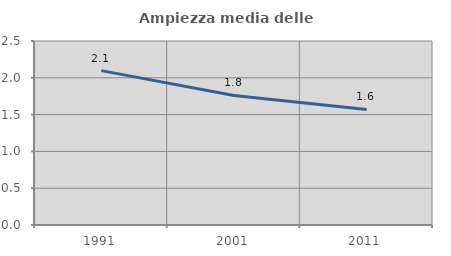
| Category | Ampiezza media delle famiglie |
|---|---|
| 1991.0 | 2.097 |
| 2001.0 | 1.76 |
| 2011.0 | 1.57 |